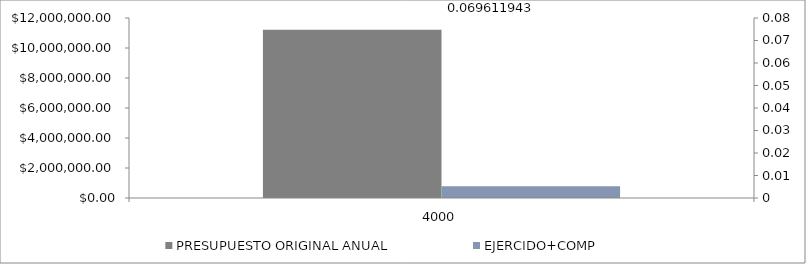
| Category | PRESUPUESTO ORIGINAL ANUAL | EJERCIDO+COMP |
|---|---|---|
| 4000.0 | 11217902.664 | 780900 |